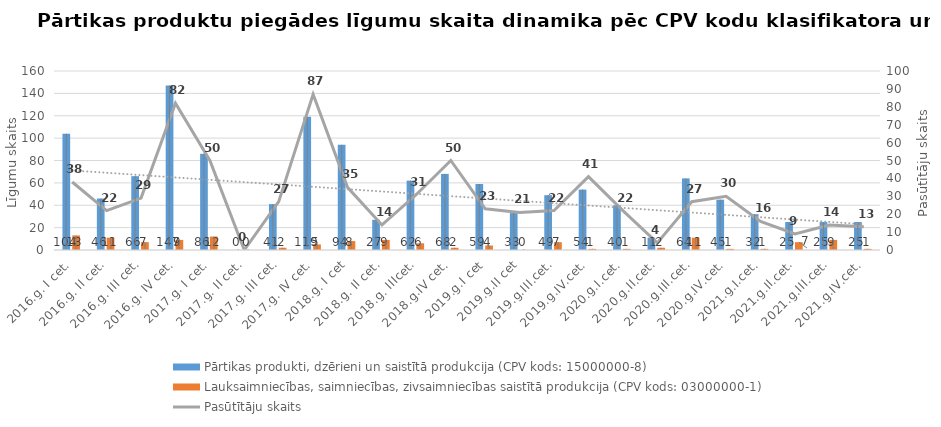
| Category | Pārtikas produkti, dzērieni un saistītā produkcija (CPV kods: 15000000-8) | Lauksaimniecības, saimniecības, zivsaimniecības saistītā produkcija (CPV kods: 03000000-1) |
|---|---|---|
| 2016.g. I cet. | 104 | 13 |
| 2016.g. II cet. | 46 | 11 |
| 2016.g. III cet. | 66 | 7 |
| 2016.g. IV cet. | 147 | 9 |
| 2017.g. I cet. | 86 | 12 |
| 2017.g. II cet. | 0 | 0 |
| 2017.g. III cet. | 41 | 2 |
| 2017.g. IV cet. | 119 | 5 |
| 2018.g. I cet | 94 | 8 |
| 2018.g. II cet. | 27 | 9 |
| 2018.g. IIIcet. | 62 | 6 |
| 2018.g.IV cet. | 68 | 2 |
| 2019.g.I cet | 59 | 4 |
| 2019.g.II cet | 33 | 0 |
| 2019.g.III.cet. | 49 | 7 |
| 2019.g.IV.cet. | 54 | 1 |
| 2020.g.I.cet. | 40 | 1 |
| 2020.g.II.cet. | 11 | 2 |
| 2020.g.III.cet. | 64 | 11 |
| 2020.g.IV.cet. | 45 | 1 |
| 2021.g.I.cet. | 32 | 1 |
| 2021.g.II.cet. | 25 | 7 |
| 2021.g.III.cet. | 25 | 9 |
| 2021.g.IV.cet. | 25 | 1 |